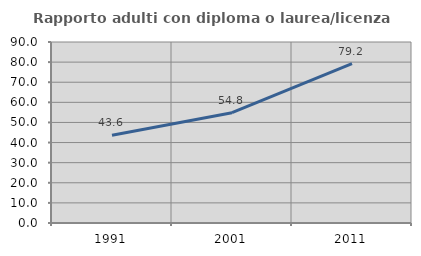
| Category | Rapporto adulti con diploma o laurea/licenza media  |
|---|---|
| 1991.0 | 43.627 |
| 2001.0 | 54.849 |
| 2011.0 | 79.217 |